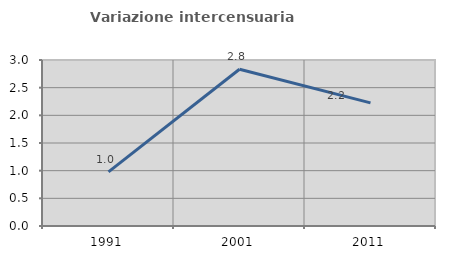
| Category | Variazione intercensuaria annua |
|---|---|
| 1991.0 | 0.978 |
| 2001.0 | 2.833 |
| 2011.0 | 2.224 |